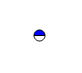
| Category | Series 0 |
|---|---|
| 0 | 5361 |
| 1 | 5388 |